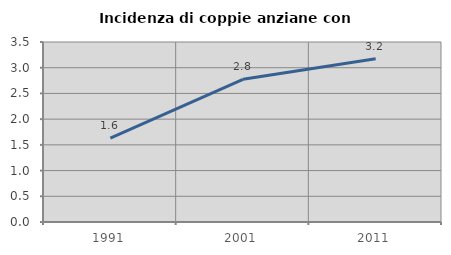
| Category | Incidenza di coppie anziane con figli |
|---|---|
| 1991.0 | 1.629 |
| 2001.0 | 2.775 |
| 2011.0 | 3.175 |